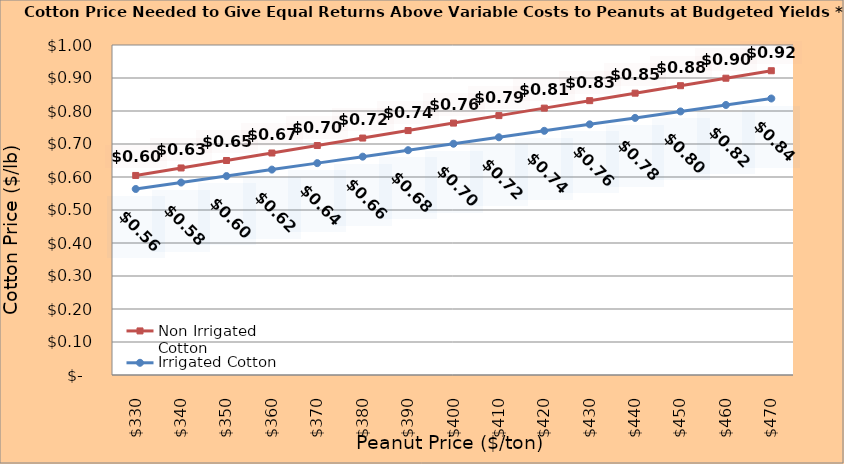
| Category | Non Irrigated Cotton | Irrigated Cotton |
|---|---|---|
| 330.0 | 0.605 | 0.564 |
| 340.0 | 0.627 | 0.583 |
| 350.0 | 0.65 | 0.603 |
| 360.0 | 0.673 | 0.622 |
| 370.0 | 0.695 | 0.642 |
| 380.0 | 0.718 | 0.662 |
| 390.0 | 0.741 | 0.681 |
| 400.0 | 0.763 | 0.701 |
| 410.0 | 0.786 | 0.72 |
| 420.0 | 0.809 | 0.74 |
| 430.0 | 0.831 | 0.76 |
| 440.0 | 0.854 | 0.779 |
| 450.0 | 0.877 | 0.799 |
| 460.0 | 0.899 | 0.818 |
| 470.0 | 0.922 | 0.838 |